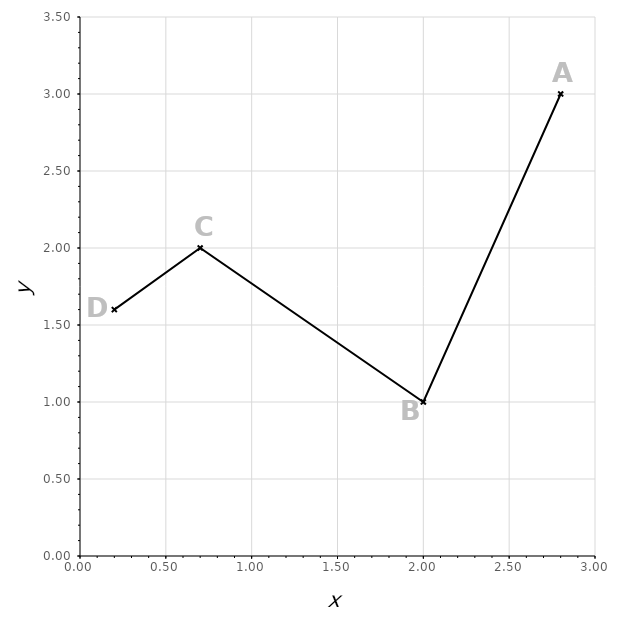
| Category | Series 0 |
|---|---|
| 2.8 | 3 |
| 2.0 | 1 |
| 0.7 | 2 |
| 0.2 | 1.6 |